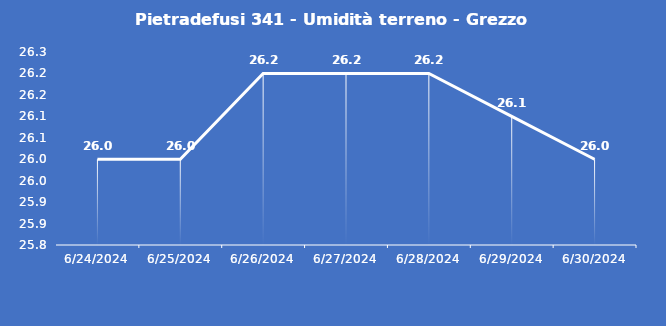
| Category | Pietradefusi 341 - Umidità terreno - Grezzo (%VWC) |
|---|---|
| 6/24/24 | 26 |
| 6/25/24 | 26 |
| 6/26/24 | 26.2 |
| 6/27/24 | 26.2 |
| 6/28/24 | 26.2 |
| 6/29/24 | 26.1 |
| 6/30/24 | 26 |